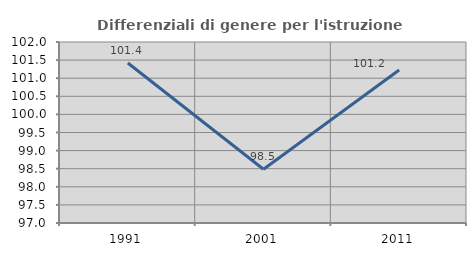
| Category | Differenziali di genere per l'istruzione superiore |
|---|---|
| 1991.0 | 101.421 |
| 2001.0 | 98.484 |
| 2011.0 | 101.225 |